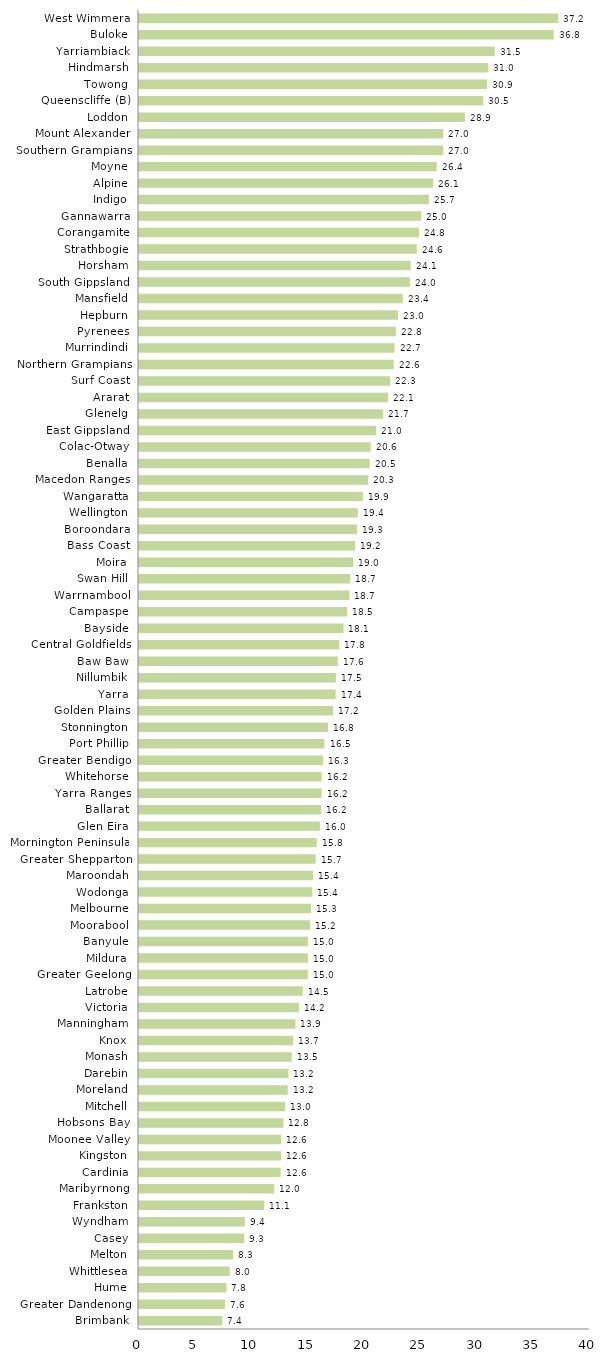
| Category | Series 0 |
|---|---|
| Brimbank | 7.386 |
| Greater Dandenong | 7.619 |
| Hume | 7.757 |
| Whittlesea | 8.047 |
| Melton | 8.339 |
| Casey | 9.336 |
| Wyndham | 9.384 |
| Frankston | 11.116 |
| Maribyrnong | 12.001 |
| Cardinia | 12.562 |
| Kingston | 12.597 |
| Moonee Valley | 12.601 |
| Hobsons Bay | 12.811 |
| Mitchell | 12.958 |
| Moreland | 13.188 |
| Darebin | 13.248 |
| Monash | 13.544 |
| Knox | 13.656 |
| Manningham | 13.876 |
| Victoria | 14.181 |
| Latrobe | 14.533 |
| Greater Geelong | 14.97 |
| Mildura | 14.984 |
| Banyule | 15 |
| Moorabool | 15.185 |
| Melbourne | 15.255 |
| Wodonga | 15.374 |
| Maroondah | 15.436 |
| Greater Shepparton | 15.673 |
| Mornington Peninsula | 15.76 |
| Glen Eira | 16.044 |
| Ballarat | 16.166 |
| Yarra Ranges | 16.196 |
| Whitehorse | 16.199 |
| Greater Bendigo | 16.315 |
| Port Phillip | 16.455 |
| Stonnington | 16.77 |
| Golden Plains | 17.22 |
| Yarra | 17.441 |
| Nillumbik | 17.458 |
| Baw Baw | 17.631 |
| Central Goldfields | 17.762 |
| Bayside | 18.136 |
| Campaspe | 18.463 |
| Warrnambool | 18.665 |
| Swan Hill | 18.742 |
| Moira | 19.02 |
| Bass Coast | 19.157 |
| Boroondara | 19.324 |
| Wellington | 19.403 |
| Wangaratta | 19.86 |
| Macedon Ranges | 20.334 |
| Benalla | 20.455 |
| Colac-Otway | 20.556 |
| East Gippsland | 21.02 |
| Glenelg | 21.655 |
| Ararat | 22.089 |
| Surf Coast | 22.282 |
| Northern Grampians | 22.589 |
| Murrindindi | 22.663 |
| Pyrenees | 22.792 |
| Hepburn | 22.978 |
| Mansfield | 23.391 |
| South Gippsland | 24.025 |
| Horsham | 24.094 |
| Strathbogie | 24.637 |
| Corangamite | 24.826 |
| Gannawarra | 25.027 |
| Indigo | 25.705 |
| Alpine | 26.089 |
| Moyne | 26.407 |
| Southern Grampians | 26.98 |
| Mount Alexander | 26.985 |
| Loddon | 28.901 |
| Queenscliffe (B) | 30.531 |
| Towong | 30.871 |
| Hindmarsh | 30.984 |
| Yarriambiack | 31.547 |
| Buloke | 36.782 |
| West Wimmera | 37.201 |